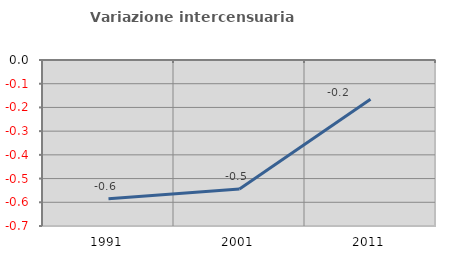
| Category | Variazione intercensuaria annua |
|---|---|
| 1991.0 | -0.585 |
| 2001.0 | -0.544 |
| 2011.0 | -0.166 |